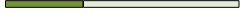
| Category | Series 0 | Series 1 | Series 2 | Series 3 |
|---|---|---|---|---|
| 0 | 6 | 12 | 0 | 0 |